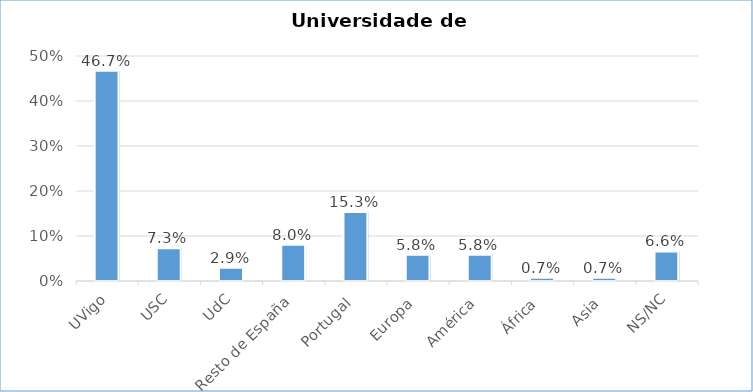
| Category | Universidade de procedencia |
|---|---|
| UVigo | 0.467 |
| USC | 0.073 |
| UdC | 0.029 |
| Resto de España | 0.08 |
| Portugal | 0.153 |
| Europa | 0.058 |
| América | 0.058 |
| África | 0.007 |
| Asia | 0.007 |
| NS/NC | 0.066 |